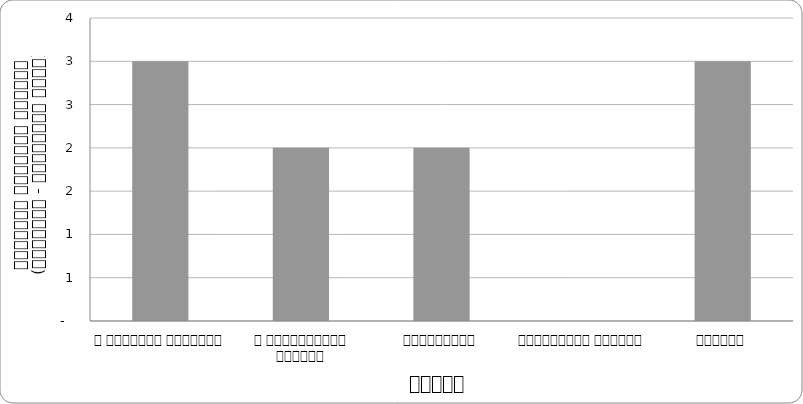
| Category | न्याय |
|---|---|
| द हिमालयन टाइम्स् | 3 |
| द काठमाण्डौं पोस्ट् | 2 |
| कान्तिपुर | 2 |
| अन्नपूर्ण पोस्ट् | 0 |
| नागरिक | 3 |